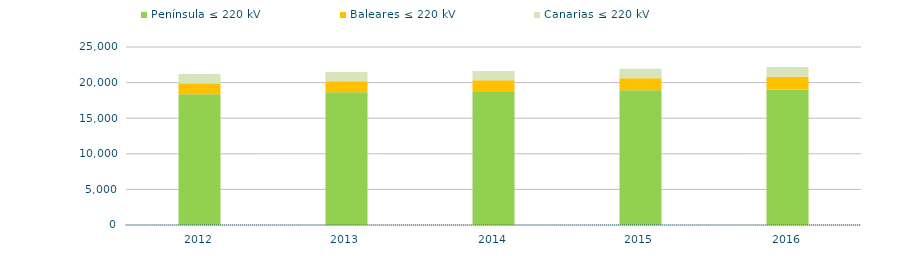
| Category | Península ≤ 220 kV | Baleares ≤ 220 kV | Canarias ≤ 220 kV |
|---|---|---|---|
| 2012.0 | 18369.641 | 1543.521 | 1289.05 |
| 2013.0 | 18642.941 | 1543.521 | 1289.05 |
| 2014.0 | 18782.059 | 1544.972 | 1289.135 |
| 2015.0 | 18922.362 | 1673.682 | 1346.959 |
| 2016.0 | 19026.041 | 1800.036 | 1354.349 |